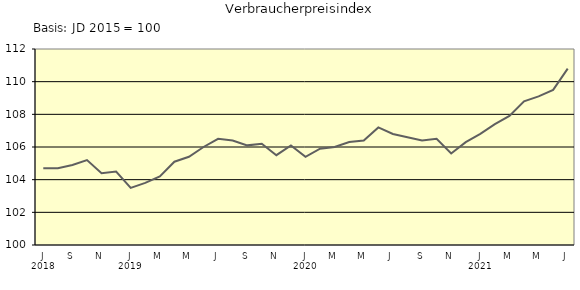
| Category | Series 0 |
|---|---|
| 0 | 104.7 |
| 1 | 104.7 |
| 2 | 104.9 |
| 3 | 105.2 |
| 4 | 104.4 |
| 5 | 104.5 |
| 6 | 103.5 |
| 7 | 103.8 |
| 8 | 104.2 |
| 9 | 105.1 |
| 10 | 105.4 |
| 11 | 106 |
| 12 | 106.5 |
| 13 | 106.4 |
| 14 | 106.1 |
| 15 | 106.2 |
| 16 | 105.5 |
| 17 | 106.1 |
| 18 | 105.4 |
| 19 | 105.9 |
| 20 | 106 |
| 21 | 106.3 |
| 22 | 106.4 |
| 23 | 107.2 |
| 24 | 106.8 |
| 25 | 106.6 |
| 26 | 106.4 |
| 27 | 106.5 |
| 28 | 105.6 |
| 29 | 106.3 |
| 30 | 106.8 |
| 31 | 107.4 |
| 32 | 107.9 |
| 33 | 108.8 |
| 34 | 109.1 |
| 35 | 109.5 |
| 36 | 110.8 |